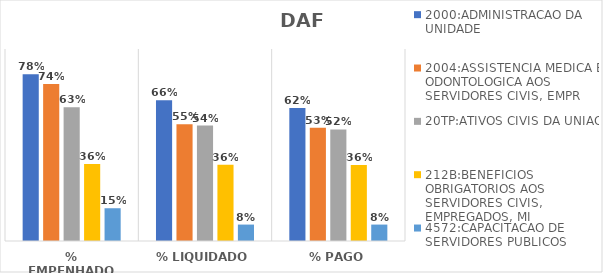
| Category | 2000:ADMINISTRACAO DA UNIDADE | 2004:ASSISTENCIA MEDICA E ODONTOLOGICA AOS SERVIDORES CIVIS, EMPR | 20TP:ATIVOS CIVIS DA UNIAO | 212B:BENEFICIOS OBRIGATORIOS AOS SERVIDORES CIVIS, EMPREGADOS, MI | 4572:CAPACITACAO DE SERVIDORES PUBLICOS FEDERAIS EM PROCESSO DE Q |
|---|---|---|---|---|---|
| % EMPENHADO | 0.782 | 0.736 | 0.627 | 0.361 | 0.154 |
| % LIQUIDADO | 0.66 | 0.547 | 0.541 | 0.357 | 0.077 |
| % PAGO | 0.624 | 0.53 | 0.523 | 0.356 | 0.077 |